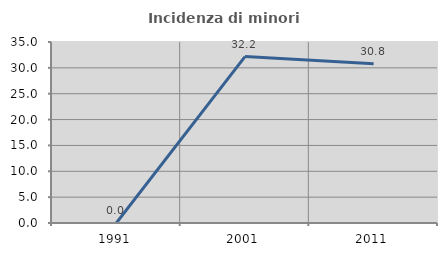
| Category | Incidenza di minori stranieri |
|---|---|
| 1991.0 | 0 |
| 2001.0 | 32.18 |
| 2011.0 | 30.808 |